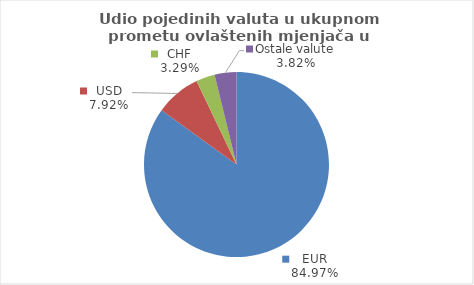
| Category | Series 0 |
|---|---|
| EUR | 84.972 |
| USD | 7.923 |
| CHF | 3.285 |
| Ostale valute | 3.821 |